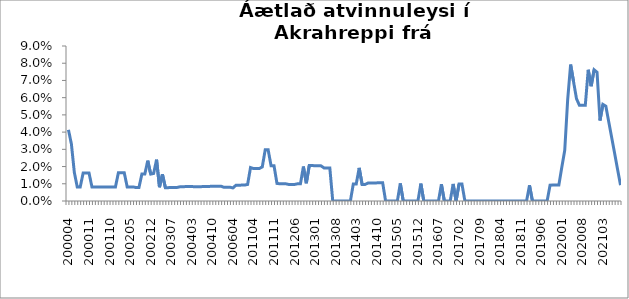
| Category | Series 0 |
|---|---|
| 200004 | 0.041 |
| 200005 | 0.033 |
| 200006 | 0.017 |
| 200007 | 0.008 |
| 200008 | 0.008 |
| 200009 | 0.016 |
| 200010 | 0.016 |
| 200011 | 0.016 |
| 200012 | 0.008 |
| 200101 | 0.008 |
| 200102 | 0.008 |
| 200103 | 0.008 |
| 200104 | 0.008 |
| 200109 | 0.008 |
| 200110 | 0.008 |
| 200111 | 0.008 |
| 200112 | 0.008 |
| 200201 | 0.016 |
| 200202 | 0.016 |
| 200203 | 0.016 |
| 200204 | 0.008 |
| 200205 | 0.008 |
| 200206 | 0.008 |
| 200207 | 0.008 |
| 200208 | 0.008 |
| 200209 | 0.016 |
| 200210 | 0.016 |
| 200211 | 0.023 |
| 200212 | 0.016 |
| 200301 | 0.016 |
| 200302 | 0.024 |
| 200303 | 0.008 |
| 200304 | 0.016 |
| 200305 | 0.008 |
| 200306 | 0.008 |
| 200307 | 0.008 |
| 200308 | 0.008 |
| 200309 | 0.008 |
| 200310 | 0.008 |
| 200312 | 0.008 |
| 200401 | 0.008 |
| 200402 | 0.008 |
| 200403 | 0.008 |
| 200404 | 0.008 |
| 200405 | 0.008 |
| 200406 | 0.008 |
| 200407 | 0.008 |
| 200408 | 0.008 |
| 200409 | 0.008 |
| 200410 | 0.009 |
| 200411 | 0.009 |
| 200412 | 0.009 |
| 200501 | 0.009 |
| 200512 | 0.008 |
| 200602 | 0.008 |
| 200603 | 0.008 |
| 200604 | 0.008 |
| 201002 | 0.009 |
| 201003 | 0.009 |
| 201004 | 0.009 |
| 201005 | 0.009 |
| 201012 | 0.01 |
| 201103 | 0.019 |
| 201104 | 0.019 |
| 201105 | 0.019 |
| 201106 | 0.019 |
| 201107 | 0.02 |
| 201108 | 0.03 |
| 201109 | 0.03 |
| 201110 | 0.02 |
| 201111 | 0.02 |
| 201112 | 0.01 |
| 201201 | 0.01 |
| 201202 | 0.01 |
| 201203 | 0.01 |
| 201204 | 0.01 |
| 201205 | 0.01 |
| 201206 | 0.01 |
| 201207 | 0.01 |
| 201208 | 0.01 |
| 201209 | 0.02 |
| 201210 | 0.01 |
| 201211 | 0.021 |
| 201212 | 0.021 |
| 201301 | 0.02 |
| 201302 | 0.02 |
| 201303 | 0.02 |
| 201304 | 0.019 |
| 201305 | 0.019 |
| 201306 | 0.019 |
| 201307 | 0 |
| 201308 | 0 |
| 201309 | 0 |
| 201310 | 0 |
| 201311 | 0 |
| 201312 | 0 |
| 201401 | 0 |
| 201402 | 0.01 |
| 201403 | 0.01 |
| 201404 | 0.019 |
| 201405 | 0.01 |
| 201406 | 0.01 |
| 201407 | 0.01 |
| 201408 | 0.01 |
| 201409 | 0.01 |
| 201410 | 0.011 |
| 201411 | 0.011 |
| 201412 | 0.011 |
| 201501 | 0 |
| 201502 | 0 |
| 201503 | 0 |
| 201504 | 0 |
| 201505 | 0 |
| 201506 | 0.01 |
| 201507 | 0 |
| 201508 | 0 |
| 201509 | 0 |
| 201510 | 0 |
| 201511 | 0 |
| 201512 | 0 |
| 201601 | 0.01 |
| 201602 | 0 |
| 201603 | 0 |
| 201604 | 0 |
| 201605 | 0 |
| 201606 | 0 |
| 201607 | 0 |
| 201608 | 0.01 |
| 201609 | 0 |
| 201610 | 0 |
| 201611 | 0 |
| 201612 | 0.01 |
| 201701 | 0 |
| 201702 | 0.01 |
| 201703 | 0.01 |
| 201704 | 0 |
| 201705 | 0 |
| 201706 | 0 |
| 201707 | 0 |
| 201708 | 0 |
| 201709 | 0 |
| 201710 | 0 |
| 201711 | 0 |
| 201712 | 0 |
| 201801 | 0 |
| 201802 | 0 |
| 201803 | 0 |
| 201804 | 0 |
| 201805 | 0 |
| 201806 | 0 |
| 201807 | 0 |
| 201808 | 0 |
| 201809 | 0 |
| 201810 | 0 |
| 201811 | 0 |
| 201812 | 0 |
| 201901 | 0 |
| 201902 | 0.009 |
| 201903 | 0 |
| 201904 | 0 |
| 201905 | 0 |
| 201906 | 0 |
| 201907 | 0 |
| 201908 | 0 |
| 201909 | 0.009 |
| 201910 | 0.009 |
| 201911 | 0.009 |
| 201912 | 0.009 |
| 202001 | 0.02 |
| 202002 | 0.029 |
| 202003 | 0.059 |
| 202004 | 0.079 |
| 202005 | 0.069 |
| 202006 | 0.059 |
| 202007 | 0.056 |
| 202008 | 0.056 |
| 202009 | 0.056 |
| 202010 | 0.076 |
| 202011 | 0.067 |
| 202012 | 0.076 |
| 202101 | 0.075 |
| 202102 | 0.047 |
| 202103 | 0.056 |
| 202104 | 0.055 |
| 202105 | 0.046 |
| 202106 | 0.037 |
| 202107 | 0.028 |
| 202108 | 0.018 |
| 202109 | 0.009 |